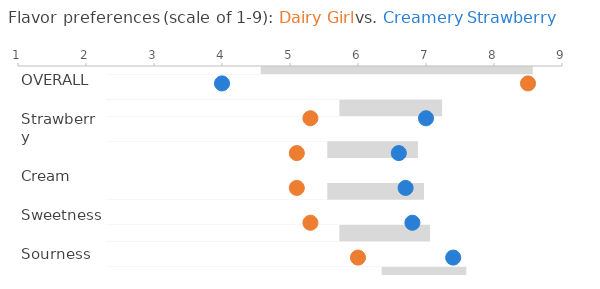
| Category | BACK (C) | FRONT (DG) |
|---|---|---|
| 7.3 | 7.4 | 6 |
| 7.0 | 6.8 | 5.3 |
| 6.6 | 6.7 | 5.1 |
| 6.7 | 6.6 | 5.1 |
| 6.8 | 7 | 5.3 |
| 7.4 | 8.5 | 4 |